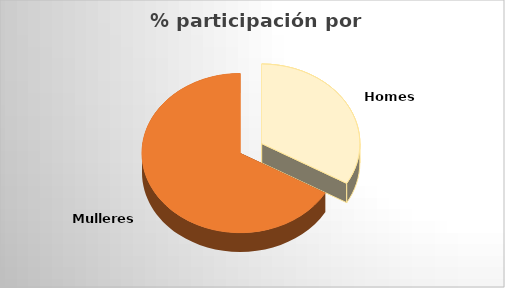
| Category | Series 0 |
|---|---|
| 0 | 9 |
| 1 | 18 |